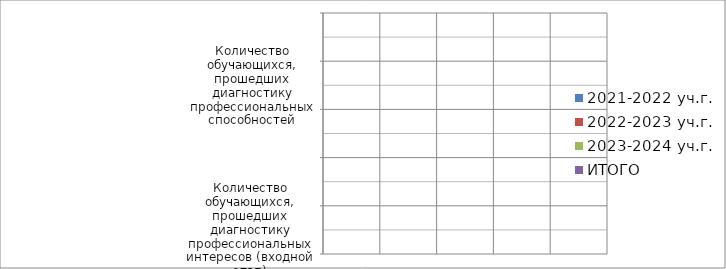
| Category | 2021-2022 уч.г. | 2022-2023 уч.г. | 2023-2024 уч.г. | ИТОГО |
|---|---|---|---|---|
| Количество обучающихся, прошедших диагностику профессиональных интересов (входной этап) |  |  |  | 0 |
| Количество обучающихся, прошедших диагностику профессиональных интересов (промежуточный этап) |  |  |  | 0 |
| Количество обучающихся, прошедших диагностику профессиональных интересов (итоговый этап) |  |  |  | 0 |
| Количество обучающихся, прошедших диагностику профессиональных способностей |  |  |  | 0 |
| Количество педагогических работников, принявших участие в исследовании профессиональных дефицитов в области развития у обучающихся навыков их профессионального самоопределения |  |  |  | 0 |